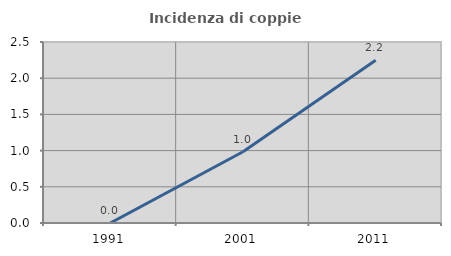
| Category | Incidenza di coppie miste |
|---|---|
| 1991.0 | 0 |
| 2001.0 | 0.984 |
| 2011.0 | 2.247 |